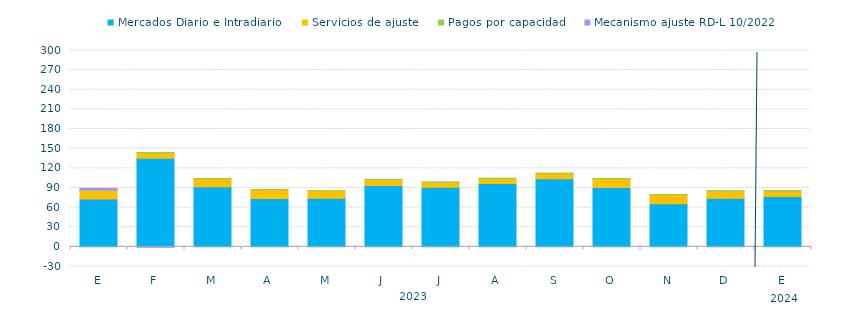
| Category | Mercados Diario e Intradiario  | Servicios de ajuste | Pagos por capacidad | Mecanismo ajuste RD-L 10/2022 |
|---|---|---|---|---|
| E | 73.09 | 13.33 | 0.34 | 2.9 |
| F | 135.42 | 8.26 | 0.35 | -0.71 |
| M | 91.84 | 12.38 | 0.24 | 0 |
| A | 74.06 | 13.31 | 0.16 | 0 |
| M | 74.23 | 11.36 | 0.17 | 0 |
| J | 93.62 | 9.11 | 0.19 | 0 |
| J | 90.89 | 7.95 | 0.33 | 0 |
| A | 96.82 | 7.66 | 0.2 | 0 |
| S | 103.95 | 8.38 | 0.18 | 0 |
| O | 90.64 | 13.61 | 0.17 | 0 |
| N | 65.94 | 13.83 | 0.23 | 0 |
| D | 74.4 | 11.03 | 0.29 | 0 |
| E | 76.88 | 9.02 | 0.35 | 0 |